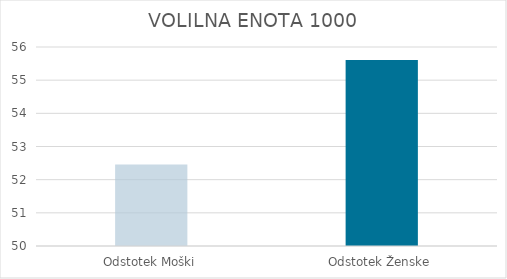
| Category | VOLILNA ENOTA 1000 |
|---|---|
| Odstotek Moški | 52.46 |
| Odstotek Ženske | 55.61 |